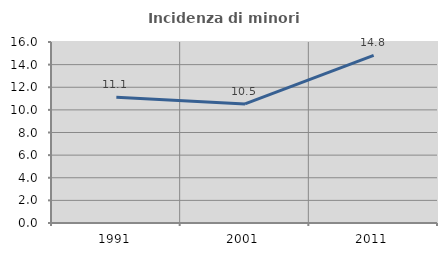
| Category | Incidenza di minori stranieri |
|---|---|
| 1991.0 | 11.111 |
| 2001.0 | 10.526 |
| 2011.0 | 14.815 |